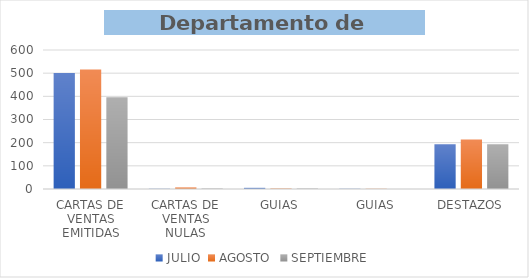
| Category | JULIO | AGOSTO | SEPTIEMBRE |
|---|---|---|---|
| CARTAS DE VENTAS EMITIDAS | 501 | 516 | 396 |
| CARTAS DE VENTAS NULAS | 1 | 7 | 2 |
| GUIAS | 5 | 2 | 2 |
| GUIAS | 1 | 1 | 0 |
| DESTAZOS | 193 | 214 | 193 |